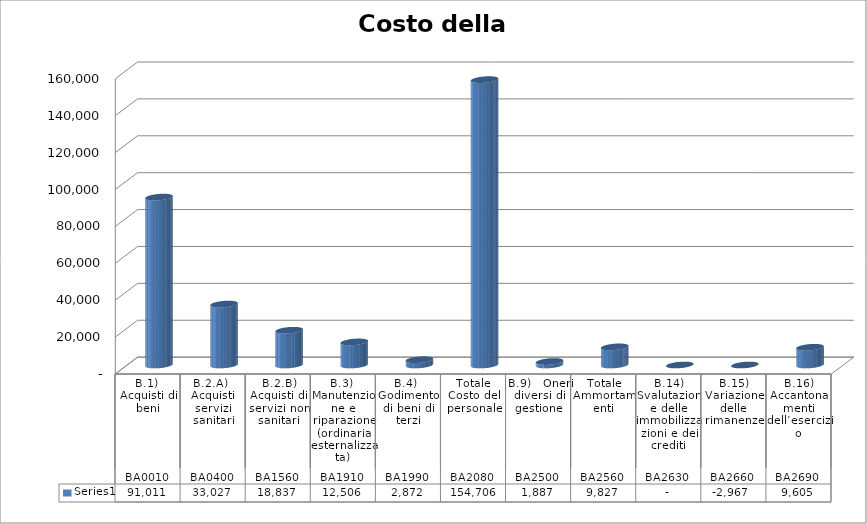
| Category | Series 0 |
|---|---|
| 0 | 91011 |
| 1 | 33027 |
| 2 | 18837 |
| 3 | 12506 |
| 4 | 2872 |
| 5 | 154706 |
| 6 | 1887 |
| 7 | 9827 |
| 8 | 0 |
| 9 | -2967 |
| 10 | 9605 |